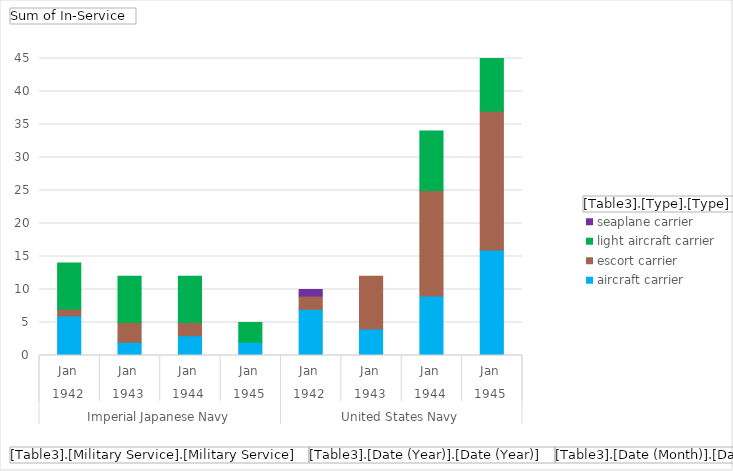
| Category | aircraft carrier | escort carrier | light aircraft carrier | seaplane carrier |
|---|---|---|---|---|
| 0 | 6 | 1 | 7 | 0 |
| 1 | 2 | 3 | 7 | 0 |
| 2 | 3 | 2 | 7 | 0 |
| 3 | 2 | 0 | 3 | 0 |
| 4 | 7 | 2 | 0 | 1 |
| 5 | 4 | 8 | 0 | 0 |
| 6 | 9 | 16 | 9 | 0 |
| 7 | 16 | 21 | 8 | 0 |